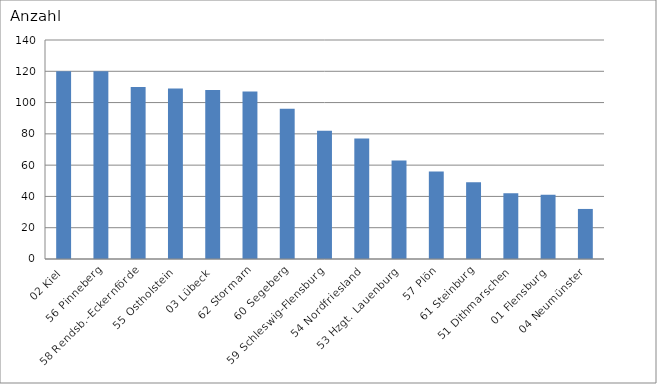
| Category | 02 Kiel 56 Pinneberg 58 Rendsb.-Eckernförde 55 Ostholstein 03 Lübeck 62 Stormarn 60 Segeberg 59 Schleswig-Flensburg 54 Nordfriesland 53 Hzgt. Lauenburg 57 Plön 61 Steinburg 51 Dithmarschen 01 Flensburg 04 Neumünster |
|---|---|
| 02 Kiel | 120 |
| 56 Pinneberg | 120 |
| 58 Rendsb.-Eckernförde | 110 |
| 55 Ostholstein | 109 |
| 03 Lübeck | 108 |
| 62 Stormarn | 107 |
| 60 Segeberg | 96 |
| 59 Schleswig-Flensburg | 82 |
| 54 Nordfriesland | 77 |
| 53 Hzgt. Lauenburg | 63 |
| 57 Plön | 56 |
| 61 Steinburg | 49 |
| 51 Dithmarschen | 42 |
| 01 Flensburg | 41 |
| 04 Neumünster | 32 |